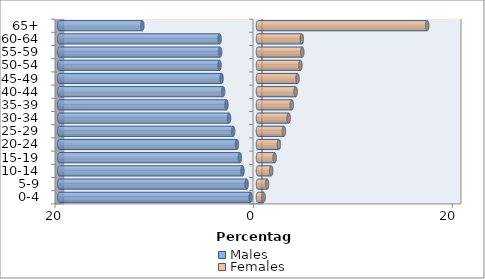
| Category | Males | Females |
|---|---|---|
| 0-4 | -0.741 | 0.561 |
| 5-9 | -1.146 | 0.916 |
| 10-14 | -1.561 | 1.325 |
| 15-19 | -1.829 | 1.677 |
| 20-24 | -2.124 | 2.103 |
| 25-29 | -2.507 | 2.606 |
| 30-34 | -2.915 | 3.086 |
| 35-39 | -3.176 | 3.405 |
| 40-44 | -3.51 | 3.791 |
| 45-49 | -3.665 | 3.985 |
| 50-54 | -3.874 | 4.271 |
| 55-59 | -3.816 | 4.458 |
| 60-64 | -3.866 | 4.41 |
| 65+ | -11.643 | 17.033 |